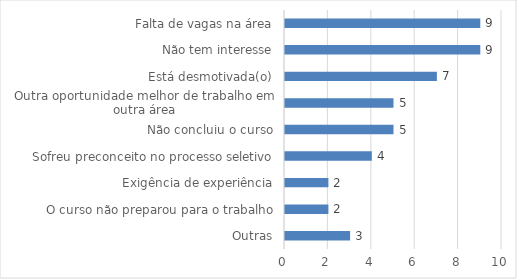
| Category | Series 0 |
|---|---|
| Outras | 3 |
| O curso não preparou para o trabalho | 2 |
| Exigência de experiência | 2 |
| Sofreu preconceito no processo seletivo | 4 |
| Não concluiu o curso | 5 |
| Outra oportunidade melhor de trabalho em outra área | 5 |
| Está desmotivada(o) | 7 |
| Não tem interesse | 9 |
| Falta de vagas na área | 9 |